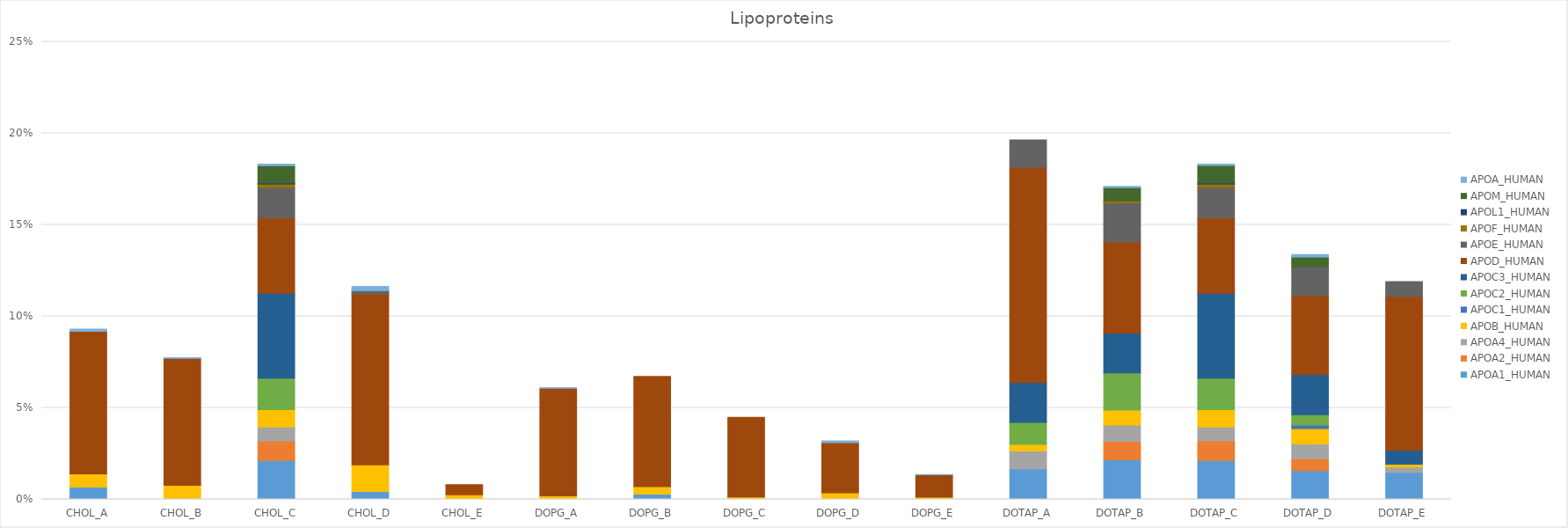
| Category | APOA1_HUMAN | APOA2_HUMAN | APOA4_HUMAN | APOB_HUMAN | APOC1_HUMAN | APOC2_HUMAN | APOC3_HUMAN | APOD_HUMAN | APOE_HUMAN | APOF_HUMAN | APOL1_HUMAN | APOM_HUMAN | APOA_HUMAN |
|---|---|---|---|---|---|---|---|---|---|---|---|---|---|
| CHOL_A | 0.007 | 0 | 0 | 0.007 | 0 | 0 | 0 | 0.078 | 0 | 0 | 0 | 0 | 0.001 |
| CHOL_B | 0 | 0 | 0 | 0.008 | 0 | 0 | 0 | 0.069 | 0 | 0 | 0 | 0 | 0 |
| CHOL_C | 0.021 | 0.011 | 0.008 | 0.01 | 0 | 0.017 | 0.046 | 0.041 | 0.017 | 0.002 | 0.001 | 0.009 | 0.001 |
| CHOL_D | 0.004 | 0 | 0 | 0.014 | 0 | 0 | 0 | 0.093 | 0.002 | 0 | 0 | 0 | 0.002 |
| CHOL_E | 0 | 0 | 0 | 0.003 | 0 | 0 | 0 | 0.006 | 0 | 0 | 0 | 0 | 0 |
| DOPG_A | 0 | 0 | 0 | 0.002 | 0 | 0 | 0 | 0.059 | 0 | 0 | 0 | 0 | 0 |
| DOPG_B | 0.003 | 0 | 0 | 0.004 | 0 | 0 | 0 | 0.06 | 0 | 0 | 0 | 0 | 0 |
| DOPG_C | 0 | 0 | 0 | 0.001 | 0 | 0 | 0 | 0.044 | 0 | 0 | 0 | 0 | 0 |
| DOPG_D | 0 | 0 | 0 | 0.004 | 0 | 0 | 0 | 0.027 | 0 | 0 | 0 | 0 | 0.001 |
| DOPG_E | 0 | 0 | 0 | 0.001 | 0 | 0 | 0 | 0.012 | 0 | 0 | 0 | 0 | 0 |
| DOTAP_A | 0.017 | 0 | 0.01 | 0.004 | 0 | 0.012 | 0.022 | 0.118 | 0.015 | 0 | 0 | 0 | 0 |
| DOTAP_B | 0.022 | 0.01 | 0.009 | 0.008 | 0 | 0.02 | 0.022 | 0.05 | 0.021 | 0.001 | 0 | 0.007 | 0.001 |
| DOTAP_C | 0.021 | 0.011 | 0.008 | 0.01 | 0 | 0.017 | 0.046 | 0.041 | 0.017 | 0.002 | 0.001 | 0.009 | 0.001 |
| DOTAP_D | 0.016 | 0.006 | 0.008 | 0.008 | 0.002 | 0.006 | 0.022 | 0.043 | 0.016 | 0 | 0 | 0.005 | 0.001 |
| DOTAP_E | 0.015 | 0 | 0.003 | 0.001 | 0 | 0 | 0.008 | 0.084 | 0.008 | 0 | 0 | 0 | 0 |